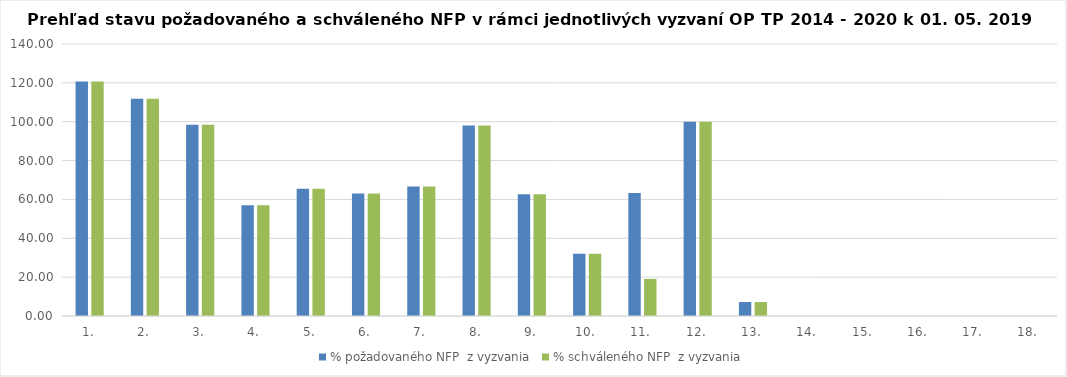
| Category | % požadovaného NFP  z vyzvania | % schváleného NFP  z vyzvania |
|---|---|---|
| 1. | 120.662 | 120.662 |
| 2. | 111.83 | 111.83 |
| 3. | 98.465 | 98.465 |
| 4. | 57.06 | 57.06 |
| 5. | 65.461 | 65.461 |
| 6. | 63.077 | 63.077 |
| 7. | 66.691 | 66.691 |
| 8. | 97.989 | 97.989 |
| 9. | 62.721 | 62.721 |
| 10. | 32.038 | 32.038 |
| 11. | 63.352 | 19.087 |
| 12. | 99.998 | 99.998 |
| 13. | 7.184 | 7.184 |
| 14. | 0 | 0 |
| 15. | 0 | 0 |
| 16. | 0 | 0 |
| 17. | 0 | 0 |
| 18. | 0 | 0 |